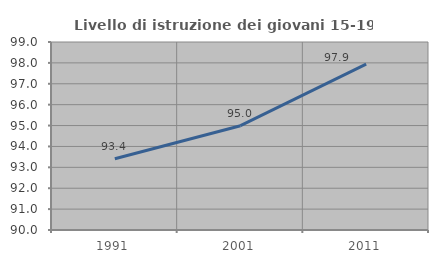
| Category | Livello di istruzione dei giovani 15-19 anni |
|---|---|
| 1991.0 | 93.41 |
| 2001.0 | 94.992 |
| 2011.0 | 97.936 |